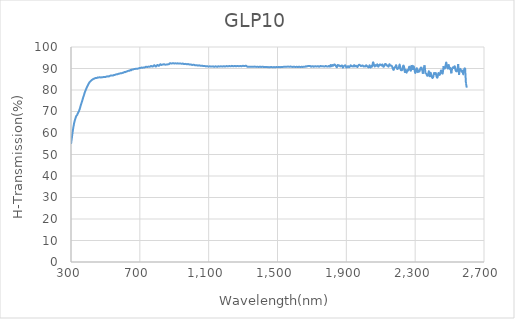
| Category | Series 0 |
|---|---|
| 300.0 | 54.886 |
| 305.0 | 57.795 |
| 310.0 | 60.757 |
| 315.0 | 63.218 |
| 320.0 | 65.231 |
| 325.0 | 66.585 |
| 330.0 | 67.799 |
| 335.0 | 68.33 |
| 340.0 | 69.184 |
| 345.0 | 69.976 |
| 350.0 | 71.012 |
| 355.0 | 72.391 |
| 360.0 | 73.727 |
| 365.0 | 74.944 |
| 370.0 | 76.294 |
| 375.0 | 77.516 |
| 380.0 | 78.843 |
| 385.0 | 79.877 |
| 390.0 | 80.839 |
| 395.0 | 81.725 |
| 400.0 | 82.529 |
| 405.0 | 83.278 |
| 410.0 | 83.815 |
| 415.0 | 84.19 |
| 420.0 | 84.622 |
| 425.0 | 84.853 |
| 430.0 | 85.173 |
| 435.0 | 85.274 |
| 440.0 | 85.498 |
| 445.0 | 85.633 |
| 450.0 | 85.575 |
| 455.0 | 85.84 |
| 460.0 | 85.81 |
| 465.0 | 85.911 |
| 470.0 | 85.887 |
| 475.0 | 85.829 |
| 480.0 | 85.946 |
| 485.0 | 85.964 |
| 490.0 | 86.069 |
| 495.0 | 86.063 |
| 500.0 | 86.03 |
| 505.0 | 86.24 |
| 510.0 | 86.265 |
| 515.0 | 86.387 |
| 520.0 | 86.274 |
| 525.0 | 86.524 |
| 530.0 | 86.71 |
| 535.0 | 86.711 |
| 540.0 | 86.757 |
| 545.0 | 86.755 |
| 550.0 | 86.989 |
| 555.0 | 87.038 |
| 560.0 | 87.203 |
| 565.0 | 87.298 |
| 570.0 | 87.299 |
| 575.0 | 87.518 |
| 580.0 | 87.576 |
| 585.0 | 87.716 |
| 590.0 | 87.812 |
| 595.0 | 87.843 |
| 600.0 | 87.981 |
| 605.0 | 88.07 |
| 610.0 | 88.34 |
| 615.0 | 88.313 |
| 620.0 | 88.477 |
| 625.0 | 88.643 |
| 630.0 | 88.856 |
| 635.0 | 88.927 |
| 640.0 | 88.949 |
| 645.0 | 89.29 |
| 650.0 | 89.182 |
| 655.0 | 89.549 |
| 660.0 | 89.547 |
| 665.0 | 89.689 |
| 670.0 | 89.753 |
| 675.0 | 89.849 |
| 680.0 | 89.894 |
| 685.0 | 89.907 |
| 690.0 | 89.965 |
| 695.0 | 90.123 |
| 700.0 | 90.284 |
| 705.0 | 90.282 |
| 710.0 | 90.43 |
| 715.0 | 90.34 |
| 720.0 | 90.457 |
| 725.0 | 90.458 |
| 730.0 | 90.561 |
| 735.0 | 90.776 |
| 740.0 | 90.749 |
| 745.0 | 90.727 |
| 750.0 | 90.877 |
| 755.0 | 90.84 |
| 760.0 | 90.86 |
| 765.0 | 91.201 |
| 770.0 | 91.041 |
| 775.0 | 90.891 |
| 780.0 | 91.288 |
| 785.0 | 91.534 |
| 790.0 | 91.017 |
| 795.0 | 90.981 |
| 800.0 | 91.535 |
| 805.0 | 91.555 |
| 810.0 | 91.227 |
| 815.0 | 91.614 |
| 820.0 | 91.976 |
| 825.0 | 91.667 |
| 830.0 | 91.799 |
| 835.0 | 91.829 |
| 840.0 | 92.019 |
| 845.0 | 91.818 |
| 850.0 | 91.8 |
| 855.0 | 91.854 |
| 860.0 | 91.916 |
| 865.0 | 91.926 |
| 870.0 | 92.047 |
| 875.0 | 92.45 |
| 880.0 | 92.382 |
| 885.0 | 92.335 |
| 890.0 | 92.443 |
| 895.0 | 92.448 |
| 900.0 | 92.34 |
| 905.0 | 92.408 |
| 910.0 | 92.371 |
| 915.0 | 92.323 |
| 920.0 | 92.412 |
| 925.0 | 92.272 |
| 930.0 | 92.321 |
| 935.0 | 92.334 |
| 940.0 | 92.256 |
| 945.0 | 92.235 |
| 950.0 | 92.292 |
| 955.0 | 92.082 |
| 960.0 | 92.083 |
| 965.0 | 92.153 |
| 970.0 | 92.036 |
| 975.0 | 91.968 |
| 980.0 | 92.063 |
| 985.0 | 91.941 |
| 990.0 | 91.809 |
| 995.0 | 91.895 |
| 1000.0 | 91.756 |
| 1005.0 | 91.656 |
| 1010.0 | 91.764 |
| 1015.0 | 91.692 |
| 1020.0 | 91.541 |
| 1025.0 | 91.508 |
| 1030.0 | 91.558 |
| 1035.0 | 91.401 |
| 1040.0 | 91.388 |
| 1045.0 | 91.473 |
| 1050.0 | 91.307 |
| 1055.0 | 91.238 |
| 1060.0 | 91.32 |
| 1065.0 | 91.237 |
| 1070.0 | 91.1 |
| 1075.0 | 91.22 |
| 1080.0 | 91.084 |
| 1085.0 | 90.971 |
| 1090.0 | 91.088 |
| 1095.0 | 90.991 |
| 1100.0 | 90.853 |
| 1105.0 | 91 |
| 1110.0 | 90.966 |
| 1115.0 | 90.89 |
| 1120.0 | 90.928 |
| 1125.0 | 90.996 |
| 1130.0 | 90.852 |
| 1135.0 | 90.861 |
| 1140.0 | 91.018 |
| 1145.0 | 90.916 |
| 1150.0 | 90.776 |
| 1155.0 | 91.042 |
| 1160.0 | 90.912 |
| 1165.0 | 90.884 |
| 1170.0 | 91.031 |
| 1175.0 | 90.979 |
| 1180.0 | 90.879 |
| 1185.0 | 91.027 |
| 1190.0 | 91.054 |
| 1195.0 | 90.916 |
| 1200.0 | 91.031 |
| 1205.0 | 91.127 |
| 1210.0 | 90.985 |
| 1215.0 | 91.051 |
| 1220.0 | 91.152 |
| 1225.0 | 91.043 |
| 1230.0 | 91.056 |
| 1235.0 | 91.232 |
| 1240.0 | 91.099 |
| 1245.0 | 91.031 |
| 1250.0 | 91.206 |
| 1255.0 | 91.144 |
| 1260.0 | 90.991 |
| 1265.0 | 91.193 |
| 1270.0 | 91.186 |
| 1275.0 | 91.061 |
| 1280.0 | 91.116 |
| 1285.0 | 91.199 |
| 1290.0 | 91.039 |
| 1295.0 | 91.151 |
| 1300.0 | 91.258 |
| 1305.0 | 91.13 |
| 1310.0 | 91.122 |
| 1315.0 | 91.274 |
| 1320.0 | 91.175 |
| 1325.0 | 90.818 |
| 1330.0 | 90.859 |
| 1335.0 | 90.854 |
| 1340.0 | 90.811 |
| 1345.0 | 90.865 |
| 1350.0 | 90.8 |
| 1355.0 | 90.762 |
| 1360.0 | 90.79 |
| 1365.0 | 90.881 |
| 1370.0 | 90.819 |
| 1375.0 | 90.777 |
| 1380.0 | 90.744 |
| 1385.0 | 90.794 |
| 1390.0 | 90.709 |
| 1395.0 | 90.795 |
| 1400.0 | 90.87 |
| 1405.0 | 90.697 |
| 1410.0 | 90.819 |
| 1415.0 | 90.84 |
| 1420.0 | 90.663 |
| 1425.0 | 90.7 |
| 1430.0 | 90.746 |
| 1435.0 | 90.655 |
| 1440.0 | 90.696 |
| 1445.0 | 90.586 |
| 1450.0 | 90.655 |
| 1455.0 | 90.588 |
| 1460.0 | 90.677 |
| 1465.0 | 90.676 |
| 1470.0 | 90.581 |
| 1475.0 | 90.59 |
| 1480.0 | 90.666 |
| 1485.0 | 90.582 |
| 1490.0 | 90.631 |
| 1495.0 | 90.7 |
| 1500.0 | 90.579 |
| 1505.0 | 90.664 |
| 1510.0 | 90.691 |
| 1515.0 | 90.614 |
| 1520.0 | 90.685 |
| 1525.0 | 90.688 |
| 1530.0 | 90.734 |
| 1535.0 | 90.762 |
| 1540.0 | 90.793 |
| 1545.0 | 90.808 |
| 1550.0 | 90.782 |
| 1555.0 | 90.821 |
| 1560.0 | 90.892 |
| 1565.0 | 90.862 |
| 1570.0 | 90.808 |
| 1575.0 | 90.897 |
| 1580.0 | 90.831 |
| 1585.0 | 90.777 |
| 1590.0 | 90.726 |
| 1595.0 | 90.867 |
| 1600.0 | 90.779 |
| 1605.0 | 90.648 |
| 1610.0 | 90.812 |
| 1615.0 | 90.729 |
| 1620.0 | 90.692 |
| 1625.0 | 90.827 |
| 1630.0 | 90.739 |
| 1635.0 | 90.631 |
| 1640.0 | 90.834 |
| 1645.0 | 90.732 |
| 1650.0 | 90.768 |
| 1655.0 | 90.845 |
| 1660.0 | 90.822 |
| 1665.0 | 91.018 |
| 1670.0 | 90.932 |
| 1675.0 | 91.113 |
| 1680.0 | 91.107 |
| 1685.0 | 91.163 |
| 1690.0 | 91.122 |
| 1695.0 | 90.847 |
| 1700.0 | 91.008 |
| 1705.0 | 91.081 |
| 1710.0 | 90.818 |
| 1715.0 | 90.973 |
| 1720.0 | 91.092 |
| 1725.0 | 90.95 |
| 1730.0 | 90.969 |
| 1735.0 | 91.085 |
| 1740.0 | 90.879 |
| 1745.0 | 90.904 |
| 1750.0 | 91.221 |
| 1755.0 | 91.03 |
| 1760.0 | 91.045 |
| 1765.0 | 91.018 |
| 1770.0 | 90.969 |
| 1775.0 | 90.957 |
| 1780.0 | 91.168 |
| 1785.0 | 91.024 |
| 1790.0 | 90.882 |
| 1795.0 | 90.972 |
| 1800.0 | 91.228 |
| 1805.0 | 90.845 |
| 1810.0 | 91.678 |
| 1815.0 | 90.992 |
| 1820.0 | 91.6 |
| 1825.0 | 91.311 |
| 1830.0 | 91.884 |
| 1835.0 | 91.638 |
| 1840.0 | 91.069 |
| 1845.0 | 90.562 |
| 1850.0 | 91.63 |
| 1855.0 | 91.222 |
| 1860.0 | 91.42 |
| 1865.0 | 90.964 |
| 1870.0 | 91.209 |
| 1875.0 | 91.35 |
| 1880.0 | 90.403 |
| 1885.0 | 91.032 |
| 1890.0 | 91.347 |
| 1895.0 | 91.399 |
| 1900.0 | 90.45 |
| 1905.0 | 90.627 |
| 1910.0 | 91.102 |
| 1915.0 | 90.616 |
| 1920.0 | 90.774 |
| 1925.0 | 91.498 |
| 1930.0 | 91.075 |
| 1935.0 | 91.096 |
| 1940.0 | 90.945 |
| 1945.0 | 91.582 |
| 1950.0 | 90.955 |
| 1955.0 | 91.283 |
| 1960.0 | 91.05 |
| 1965.0 | 90.705 |
| 1970.0 | 91.498 |
| 1975.0 | 91.758 |
| 1980.0 | 91.462 |
| 1985.0 | 91.087 |
| 1990.0 | 91.319 |
| 1995.0 | 91.441 |
| 2000.0 | 90.944 |
| 2005.0 | 91.035 |
| 2010.0 | 90.973 |
| 2015.0 | 91.509 |
| 2020.0 | 91.116 |
| 2025.0 | 90.747 |
| 2030.0 | 90.542 |
| 2035.0 | 91.518 |
| 2040.0 | 90.431 |
| 2045.0 | 91.135 |
| 2050.0 | 90.947 |
| 2055.0 | 92.838 |
| 2060.0 | 91.964 |
| 2065.0 | 90.944 |
| 2070.0 | 91.588 |
| 2075.0 | 91.307 |
| 2080.0 | 91.924 |
| 2085.0 | 90.889 |
| 2090.0 | 91.386 |
| 2095.0 | 91.888 |
| 2100.0 | 91.673 |
| 2105.0 | 91.376 |
| 2110.0 | 91.85 |
| 2115.0 | 90.839 |
| 2120.0 | 91.117 |
| 2125.0 | 92.057 |
| 2130.0 | 92.008 |
| 2135.0 | 91.408 |
| 2140.0 | 91.347 |
| 2145.0 | 90.877 |
| 2150.0 | 91.98 |
| 2155.0 | 91.377 |
| 2160.0 | 91.337 |
| 2165.0 | 91.094 |
| 2170.0 | 89.949 |
| 2175.0 | 89.365 |
| 2180.0 | 90.492 |
| 2185.0 | 90.712 |
| 2190.0 | 91.532 |
| 2195.0 | 89.873 |
| 2200.0 | 89.953 |
| 2205.0 | 90.413 |
| 2210.0 | 91.807 |
| 2215.0 | 89.589 |
| 2220.0 | 89.145 |
| 2225.0 | 89.421 |
| 2230.0 | 91.189 |
| 2235.0 | 90.933 |
| 2240.0 | 88.362 |
| 2245.0 | 89.383 |
| 2250.0 | 87.992 |
| 2255.0 | 89.225 |
| 2260.0 | 89.085 |
| 2265.0 | 90.739 |
| 2270.0 | 90.423 |
| 2275.0 | 88.986 |
| 2280.0 | 91.644 |
| 2285.0 | 89.345 |
| 2290.0 | 91.053 |
| 2295.0 | 90.014 |
| 2300.0 | 87.981 |
| 2305.0 | 88.822 |
| 2310.0 | 90.137 |
| 2315.0 | 88.343 |
| 2320.0 | 89.152 |
| 2325.0 | 88.612 |
| 2330.0 | 90.01 |
| 2335.0 | 90.44 |
| 2340.0 | 89.528 |
| 2345.0 | 87.544 |
| 2350.0 | 90.728 |
| 2355.0 | 91.456 |
| 2360.0 | 87.497 |
| 2365.0 | 87.48 |
| 2370.0 | 86.643 |
| 2375.0 | 86.884 |
| 2380.0 | 88.741 |
| 2385.0 | 86.387 |
| 2390.0 | 88.122 |
| 2395.0 | 86.453 |
| 2400.0 | 85.602 |
| 2405.0 | 86.098 |
| 2410.0 | 87.892 |
| 2415.0 | 87.402 |
| 2420.0 | 87.879 |
| 2425.0 | 86.063 |
| 2430.0 | 85.884 |
| 2435.0 | 87.856 |
| 2440.0 | 87.062 |
| 2445.0 | 87.366 |
| 2450.0 | 89.057 |
| 2455.0 | 88.393 |
| 2460.0 | 87.744 |
| 2465.0 | 91.093 |
| 2470.0 | 89.633 |
| 2475.0 | 90.615 |
| 2480.0 | 92.774 |
| 2485.0 | 91.176 |
| 2490.0 | 89.953 |
| 2495.0 | 91.714 |
| 2500.0 | 89.89 |
| 2505.0 | 90.164 |
| 2510.0 | 87.749 |
| 2515.0 | 90.173 |
| 2520.0 | 90.574 |
| 2525.0 | 90.238 |
| 2530.0 | 91.018 |
| 2535.0 | 89.144 |
| 2540.0 | 88.654 |
| 2545.0 | 89.108 |
| 2550.0 | 92.055 |
| 2555.0 | 87.059 |
| 2560.0 | 90.042 |
| 2565.0 | 89.515 |
| 2570.0 | 88.495 |
| 2575.0 | 88.99 |
| 2580.0 | 87.28 |
| 2585.0 | 89.652 |
| 2590.0 | 90.32 |
| 2595.0 | 83.134 |
| 2600.0 | 81.117 |